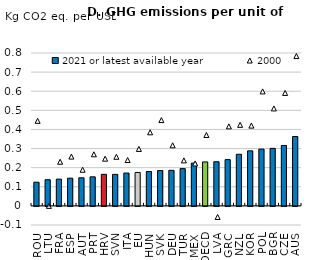
| Category | 2021 or latest available year |
|---|---|
| ROU | 0.124 |
| LTU | 0.137 |
| FRA | 0.14 |
| ESP | 0.145 |
| AUT | 0.147 |
| PRT | 0.152 |
| HRV | 0.165 |
| SVN | 0.165 |
| ITA | 0.172 |
| EU | 0.175 |
| HUN | 0.18 |
| SVK | 0.185 |
| DEU | 0.186 |
| TUR | 0.195 |
| MEX | 0.224 |
| OECD | 0.23 |
| LVA | 0.231 |
| GRC | 0.242 |
| NZL | 0.27 |
| KOR | 0.288 |
| POL | 0.297 |
| BGR | 0.301 |
| CZE | 0.316 |
| AUS | 0.363 |